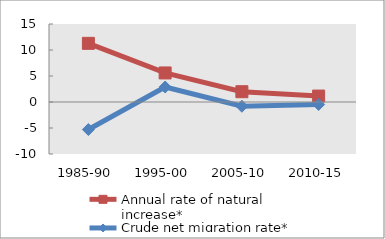
| Category | Annual rate of natural increase* | Crude net migration rate* |
|---|---|---|
| 1985-90 | 11.281 | -5.299 |
| 1995-00 | 5.587 | 2.884 |
| 2005-10 | 1.98 | -0.819 |
| 2010-15 | 1.143 | -0.475 |